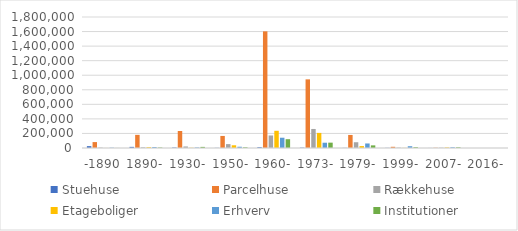
| Category | Stuehuse | Parcelhuse | Rækkehuse | Etageboliger | Erhverv | Institutioner |
|---|---|---|---|---|---|---|
| -1890 | 25743.507 | 81359.92 | 5029.047 | 498.222 | 4129.758 | 738.188 |
| 1890- | 15726.51 | 180562.665 | 9346.534 | 11043.797 | 13280.29 | 6609.671 |
| 1930- | 6686.118 | 233953.472 | 21052.603 | 3080.07 | 7093.688 | 15205.392 |
| 1950- | 2130.144 | 165595.627 | 53398.682 | 37358.141 | 17322.982 | 9514.49 |
| 1960- | 11669.678 | 1602847.872 | 172124.38 | 236470.726 | 141209.364 | 120774.384 |
| 1973- | 5158.219 | 943140.757 | 261511.026 | 207321.444 | 72483.35 | 73451.055 |
| 1979- | 1802.983 | 179210.511 | 79265.424 | 26275.318 | 62231.738 | 36159.289 |
| 1999- | 1995.313 | 16559.427 | 4982.848 | 1723.392 | 24499.705 | 11238.336 |
| 2007- | 716.313 | 3241.019 | 3915.972 | 6792.153 | 10097.412 | 9553.001 |
| 2016- | 0 | 223.468 | 0 | 0 | 0 | 0 |